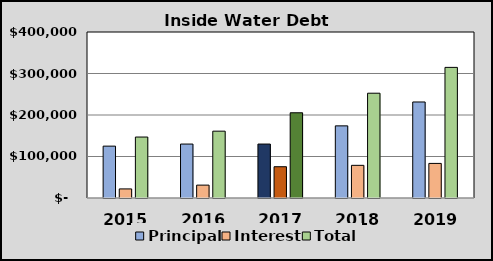
| Category | Principal | Interest | Total |
|---|---|---|---|
| 2015.0 | 125000 | 21887.5 | 146887.5 |
| 2016.0 | 130000 | 31047.836 | 161047.836 |
| 2017.0 | 130000 | 75350.5 | 205350.5 |
| 2018.0 | 173800 | 78708.148 | 252508.148 |
| 2019.0 | 231400 | 83357.004 | 314757.004 |